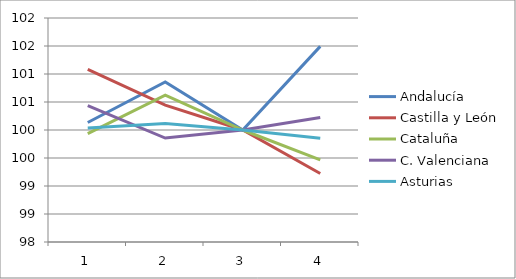
| Category | Andalucía | Castilla y León | Cataluña | C. Valenciana | Asturias |
|---|---|---|---|---|---|
| 0 | 100.135 | 101.083 | 99.935 | 100.434 | 100.037 |
| 1 | 100.858 | 100.445 | 100.622 | 99.856 | 100.114 |
| 2 | 100 | 100 | 100 | 100 | 100 |
| 3 | 101.494 | 99.223 | 99.467 | 100.224 | 99.854 |